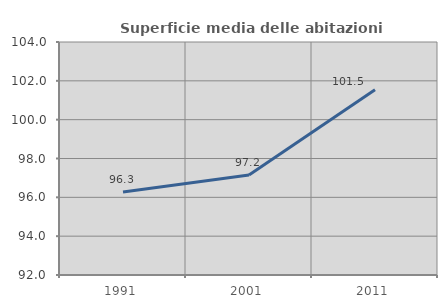
| Category | Superficie media delle abitazioni occupate |
|---|---|
| 1991.0 | 96.28 |
| 2001.0 | 97.154 |
| 2011.0 | 101.547 |